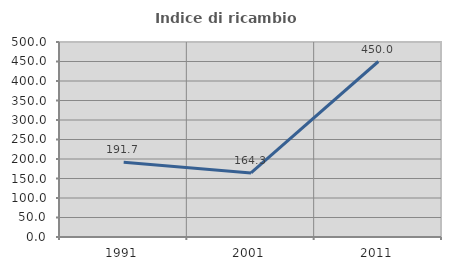
| Category | Indice di ricambio occupazionale  |
|---|---|
| 1991.0 | 191.667 |
| 2001.0 | 164.286 |
| 2011.0 | 450 |